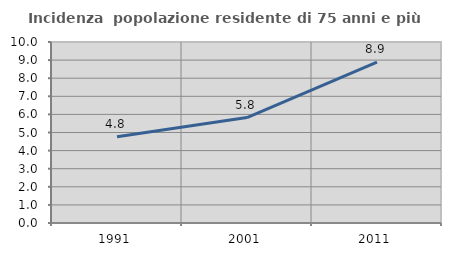
| Category | Incidenza  popolazione residente di 75 anni e più |
|---|---|
| 1991.0 | 4.76 |
| 2001.0 | 5.823 |
| 2011.0 | 8.891 |